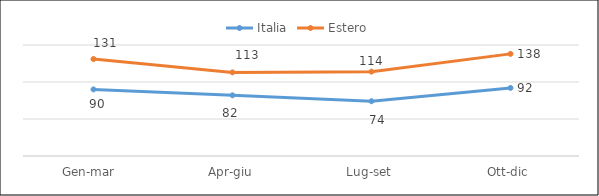
| Category | Italia | Estero |
|---|---|---|
| Gen-mar  | 90 | 131 |
| Apr-giu | 82 | 113 |
| Lug-set | 74 | 114 |
| Ott-dic | 92 | 138 |